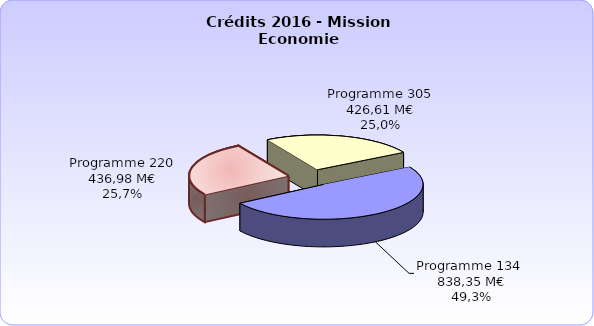
| Category | Series 0 |
|---|---|
| 134. - Développement des entreprises et du tourisme | 838352966.413 |
| 220. - Statistiques et études économiques | 436976038 |
| 305. - Stratégie économique et fiscale | 426608947 |